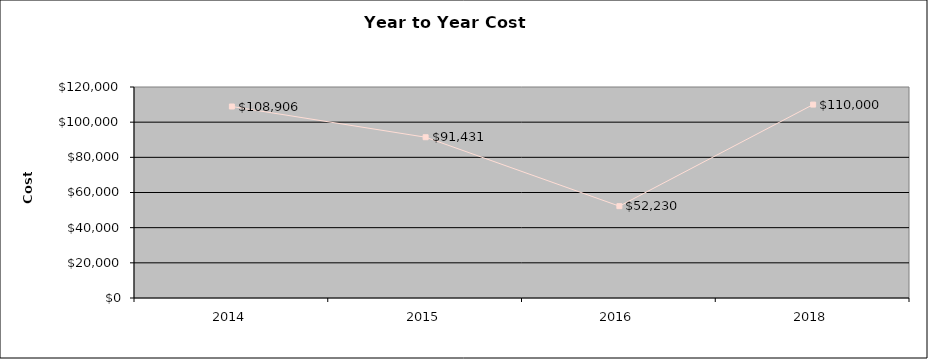
| Category | Series 1 |
|---|---|
| 2014.0 | 108906 |
| 2015.0 | 91431 |
| 2016.0 | 52230 |
| 2018.0 | 110000 |